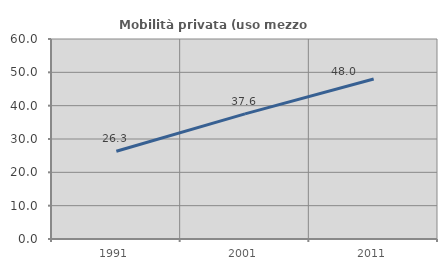
| Category | Mobilità privata (uso mezzo privato) |
|---|---|
| 1991.0 | 26.316 |
| 2001.0 | 37.551 |
| 2011.0 | 48.009 |